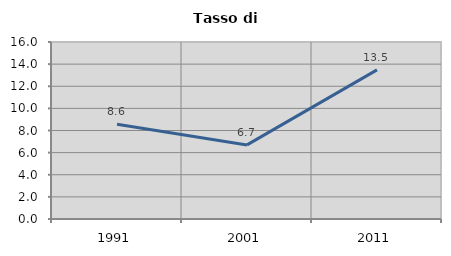
| Category | Tasso di disoccupazione   |
|---|---|
| 1991.0 | 8.563 |
| 2001.0 | 6.698 |
| 2011.0 | 13.482 |